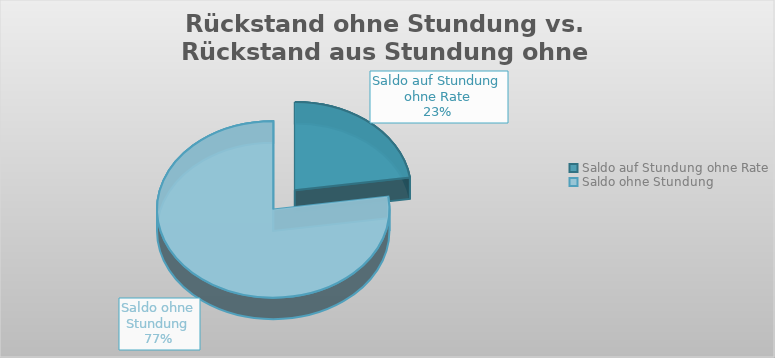
| Category | Series 0 |
|---|---|
| Saldo auf Stundung ohne Rate | 3550 |
| Saldo ohne Stundung | 12100 |